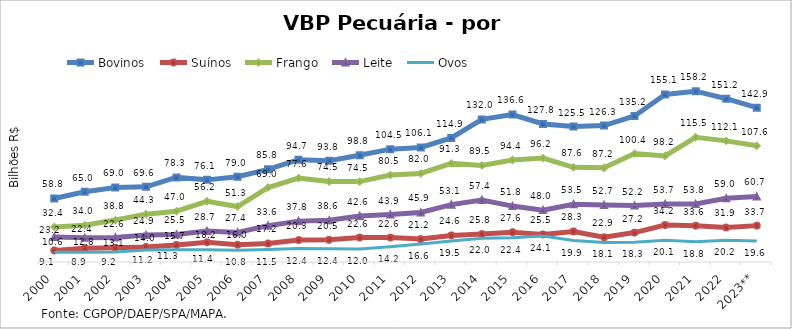
| Category | Bovinos | Suínos | Frango | Leite | Ovos |
|---|---|---|---|---|---|
| 2000 | 58.808 | 10.648 | 32.36 | 23.229 | 9.082 |
| 2001 | 65.007 | 12.775 | 34.012 | 22.353 | 8.95 |
| 2002 | 68.985 | 13.093 | 38.824 | 22.634 | 9.221 |
| 2003 | 69.624 | 13.993 | 44.263 | 24.925 | 11.154 |
| 2004 | 78.335 | 15.733 | 47.001 | 25.474 | 11.304 |
| 2005 | 76.052 | 18.241 | 56.193 | 28.651 | 11.381 |
| 2006 | 78.961 | 16.045 | 51.335 | 27.367 | 10.811 |
| 2007 | 85.812 | 17.157 | 68.973 | 33.643 | 11.49 |
| 2008 | 94.747 | 20.316 | 77.641 | 37.847 | 12.409 |
| 2009 | 93.758 | 20.537 | 74.547 | 38.585 | 12.373 |
| 2010 | 98.85 | 22.592 | 74.457 | 42.612 | 12.034 |
| 2011 | 104.499 | 22.628 | 80.528 | 43.928 | 14.18 |
| 2012 | 106.057 | 21.246 | 82.031 | 45.903 | 16.622 |
| 2013 | 114.928 | 24.6 | 91.302 | 53.119 | 19.55 |
| 2014 | 132.032 | 25.838 | 89.455 | 57.362 | 21.965 |
| 2015 | 136.576 | 27.613 | 94.437 | 51.779 | 22.365 |
| 2016 | 127.841 | 25.482 | 96.225 | 48.045 | 24.111 |
| 2017 | 125.454 | 28.288 | 87.644 | 53.532 | 19.874 |
| 2018 | 126.295 | 22.909 | 87.166 | 52.736 | 18.072 |
| 2019 | 135.234 | 27.23 | 100.363 | 52.247 | 18.302 |
| 2020 | 155.122 | 34.228 | 98.192 | 53.717 | 20.1 |
| 2021 | 158.183 | 33.619 | 115.512 | 53.777 | 18.835 |
| 2022 | 151.187 | 31.946 | 112.145 | 58.975 | 20.225 |
| 2023** | 142.918 | 33.678 | 107.567 | 60.709 | 19.55 |